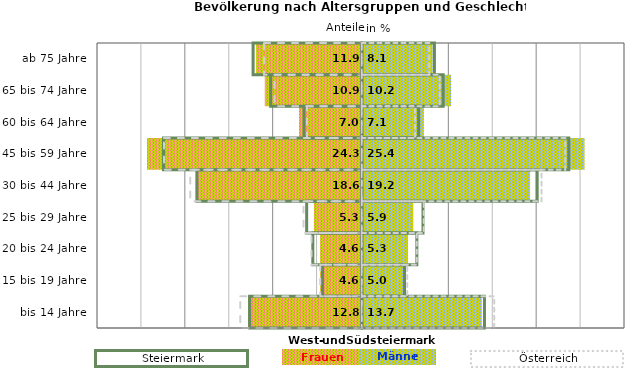
| Category | Frauen | Männer | Frauen Spalte2 | Männer Spalte2 | Frauen Spalte3 | Männer Spalte3 |
|---|---|---|---|---|---|---|
| bis 14 Jahre | -12.8 | 13.7 | 14 | -12.8 | -13.8 | 15.1 |
| 15 bis 19 Jahre | -4.6 | 5 | 4.9 | -4.5 | -4.7 | 5.2 |
| 20 bis 24 Jahre | -4.6 | 5.3 | 6.3 | -5.6 | -5.7 | 6.3 |
| 25 bis 29 Jahre | -5.3 | 5.9 | 7 | -6.3 | -6.6 | 7.1 |
| 30 bis 44 Jahre | -18.6 | 19.2 | 20 | -18.8 | -19.5 | 20.5 |
| 45 bis 59 Jahre | -24.3 | 25.4 | 23.6 | -22.6 | -22.5 | 23.2 |
| 60 bis 64 Jahre | -7 | 7.1 | 6.5 | -6.6 | -6.2 | 6.1 |
| 65 bis 74 Jahre | -10.9 | 10.2 | 9.3 | -10.4 | -9.9 | 8.9 |
| ab 75 Jahre | -11.9 | 8.1 | 8.3 | -12.4 | -11.1 | 7.7 |